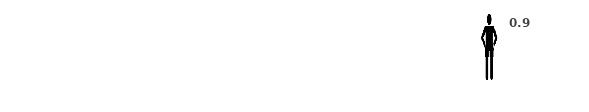
| Category | Service Level | Image Width | Remaining Part |
|---|---|---|---|
| 0 | 0.875 | 0.05 | 0.125 |